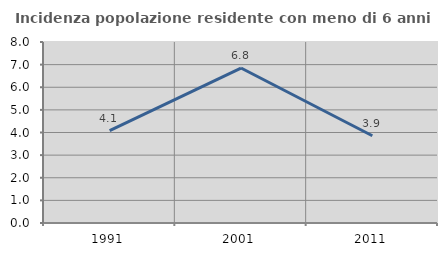
| Category | Incidenza popolazione residente con meno di 6 anni |
|---|---|
| 1991.0 | 4.082 |
| 2001.0 | 6.849 |
| 2011.0 | 3.856 |